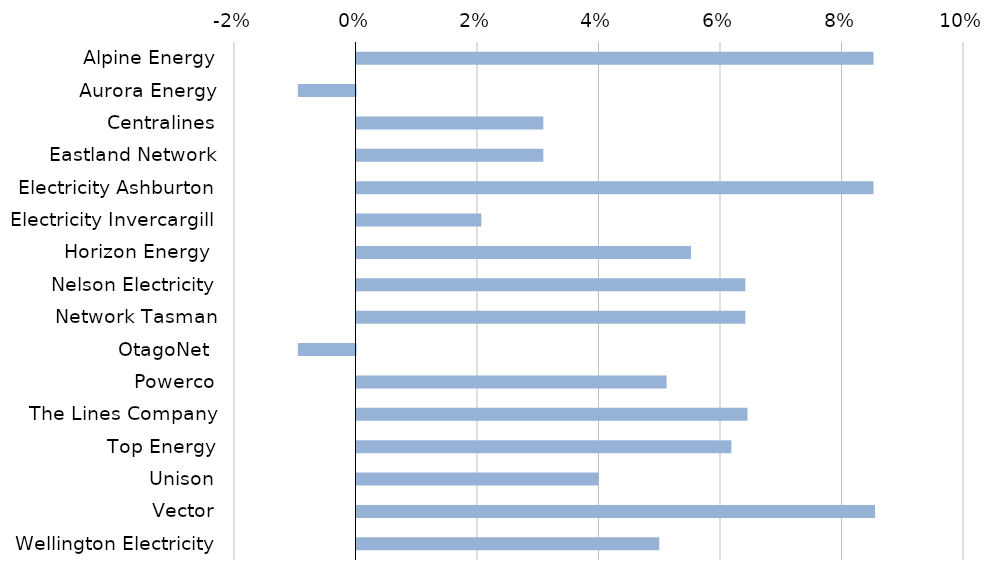
| Category | Cummulative change |
|---|---|
| Alpine Energy | 0.085 |
| Aurora Energy | -0.009 |
| Centralines | 0.031 |
| Eastland Network | 0.031 |
| Electricity Ashburton | 0.085 |
| Electricity Invercargill | 0.021 |
| Horizon Energy  | 0.055 |
| Nelson Electricity | 0.064 |
| Network Tasman | 0.064 |
| OtagoNet  | -0.009 |
| Powerco | 0.051 |
| The Lines Company | 0.064 |
| Top Energy | 0.062 |
| Unison | 0.04 |
| Vector | 0.085 |
| Wellington Electricity | 0.05 |